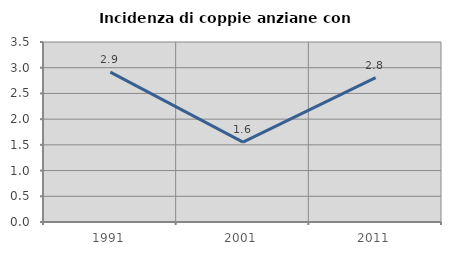
| Category | Incidenza di coppie anziane con figli |
|---|---|
| 1991.0 | 2.915 |
| 2001.0 | 1.553 |
| 2011.0 | 2.807 |